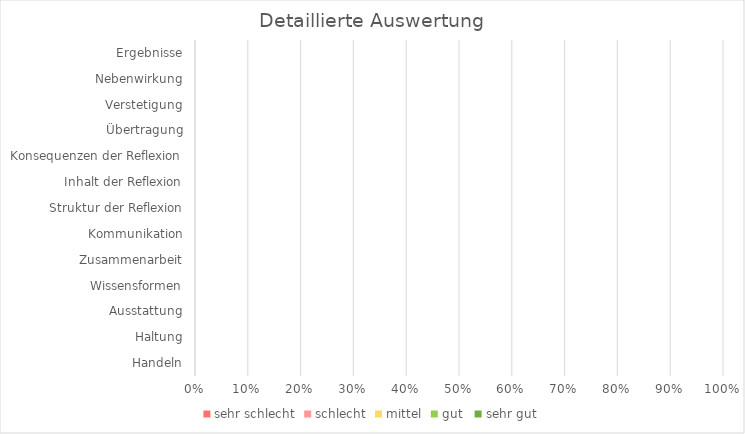
| Category | sehr schlecht | schlecht | mittel | gut  | sehr gut |
|---|---|---|---|---|---|
| Handeln | 0 | 0 | 0 | 0 | 0 |
| Haltung | 0 | 0 | 0 | 0 | 0 |
| Ausstattung | 0 | 0 | 0 | 0 | 0 |
| Wissensformen | 0 | 0 | 0 | 0 | 0 |
| Zusammenarbeit | 0 | 0 | 0 | 0 | 0 |
| Kommunikation | 0 | 0 | 0 | 0 | 0 |
| Struktur der Reflexion | 0 | 0 | 0 | 0 | 0 |
| Inhalt der Reflexion | 0 | 0 | 0 | 0 | 0 |
| Konsequenzen der Reflexion | 0 | 0 | 0 | 0 | 0 |
| Übertragung | 0 | 0 | 0 | 0 | 0 |
| Verstetigung | 0 | 0 | 0 | 0 | 0 |
| Nebenwirkung | 0 | 0 | 0 | 0 | 0 |
| Ergebnisse | 0 | 0 | 0 | 0 | 0 |